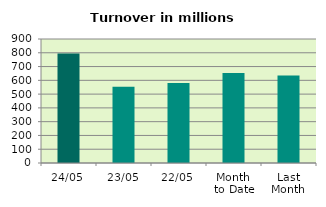
| Category | Series 0 |
|---|---|
| 24/05 | 795.484 |
| 23/05 | 554.156 |
| 22/05 | 580.206 |
| Month 
to Date | 653.471 |
| Last
Month | 634.312 |